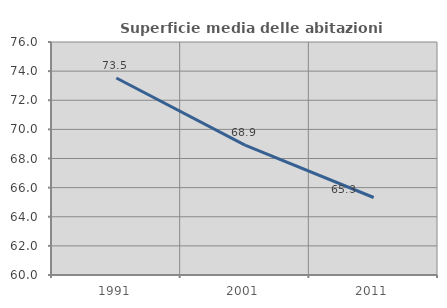
| Category | Superficie media delle abitazioni occupate |
|---|---|
| 1991.0 | 73.526 |
| 2001.0 | 68.917 |
| 2011.0 | 65.321 |